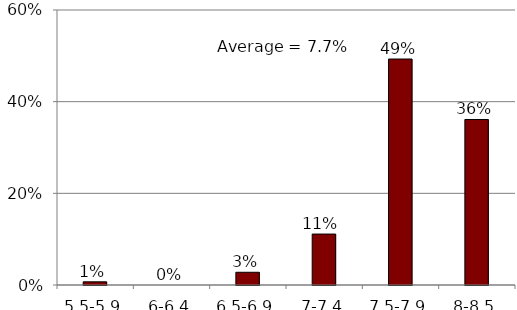
| Category | Series 0 |
|---|---|
| 5.5-5.9 | 0.007 |
| 6-6.4 | 0 |
| 6.5-6.9 | 0.028 |
| 7-7.4 | 0.111 |
| 7.5-7.9 | 0.493 |
| 8-8.5 | 0.361 |